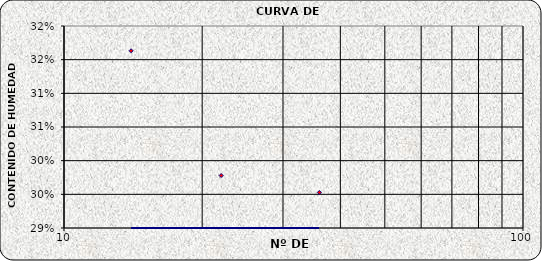
| Category | Series 0 |
|---|---|
| 36.0 | 0.295 |
| 22.0 | 0.298 |
| 14.0 | 0.316 |